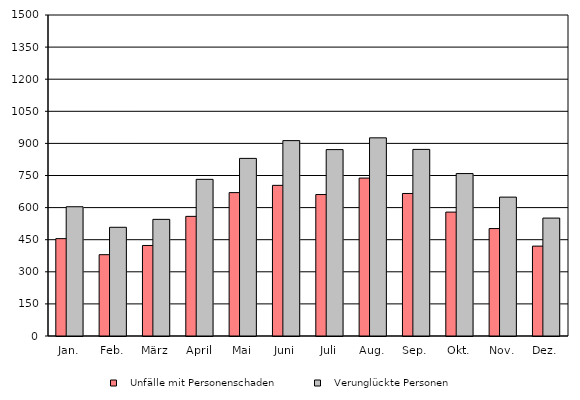
| Category |    Unfälle mit Personenschaden |    Verunglückte Personen |
|---|---|---|
| Jan. | 455 | 604 |
| Feb. | 380 | 508 |
| März | 423 | 545 |
| April | 559 | 732 |
| Mai | 670 | 830 |
| Juni | 704 | 913 |
| Juli | 661 | 871 |
| Aug. | 738 | 926 |
| Sep. | 666 | 872 |
| Okt. | 579 | 759 |
| Nov. | 502 | 649 |
| Dez. | 420 | 551 |